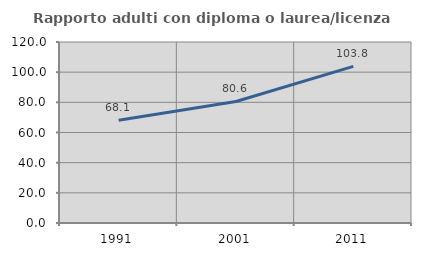
| Category | Rapporto adulti con diploma o laurea/licenza media  |
|---|---|
| 1991.0 | 68.094 |
| 2001.0 | 80.556 |
| 2011.0 | 103.829 |